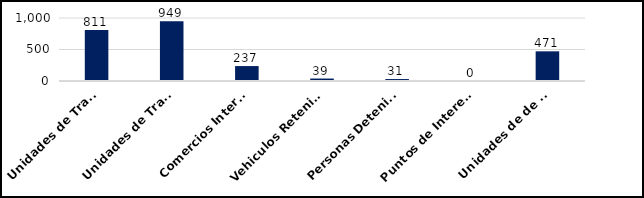
| Category | Series 0 |
|---|---|
| Unidades de Transporte de Combustibles Inspeccionados | 811 |
| Unidades de Transporte de Mercancias Inspeccionadas | 949 |
| Comercios Intervenidos | 237 |
| Vehiculos Retenidos  | 39 |
| Personas Detenidas | 31 |
| Puntos de Interes intervenidos | 0 |
| Unidades de de Transporte Desechos Oleosos Inspeccionadas  | 471 |